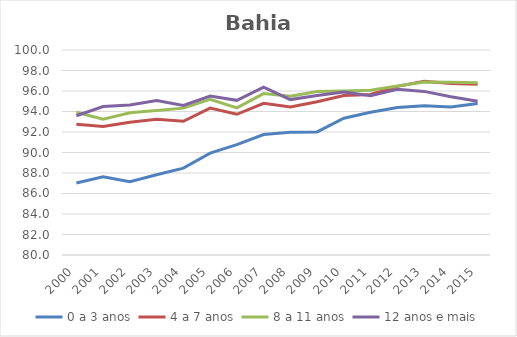
| Category | 0 a 3 anos | 4 a 7 anos | 8 a 11 anos | 12 anos e mais |
|---|---|---|---|---|
| 2000.0 | 87.024 | 92.749 | 93.93 | 93.584 |
| 2001.0 | 87.633 | 92.541 | 93.243 | 94.483 |
| 2002.0 | 87.148 | 92.95 | 93.872 | 94.629 |
| 2003.0 | 87.824 | 93.247 | 94.09 | 95.076 |
| 2004.0 | 88.475 | 93.045 | 94.328 | 94.599 |
| 2005.0 | 89.944 | 94.337 | 95.189 | 95.503 |
| 2006.0 | 90.772 | 93.728 | 94.347 | 95.091 |
| 2007.0 | 91.753 | 94.799 | 95.746 | 96.385 |
| 2008.0 | 91.971 | 94.436 | 95.484 | 95.162 |
| 2009.0 | 92.01 | 94.954 | 95.94 | 95.566 |
| 2010.0 | 93.34 | 95.562 | 96.005 | 95.892 |
| 2011.0 | 93.924 | 95.667 | 96.085 | 95.527 |
| 2012.0 | 94.396 | 96.453 | 96.488 | 96.167 |
| 2013.0 | 94.563 | 96.95 | 96.886 | 95.963 |
| 2014.0 | 94.449 | 96.725 | 96.855 | 95.435 |
| 2015.0 | 94.775 | 96.66 | 96.813 | 94.994 |